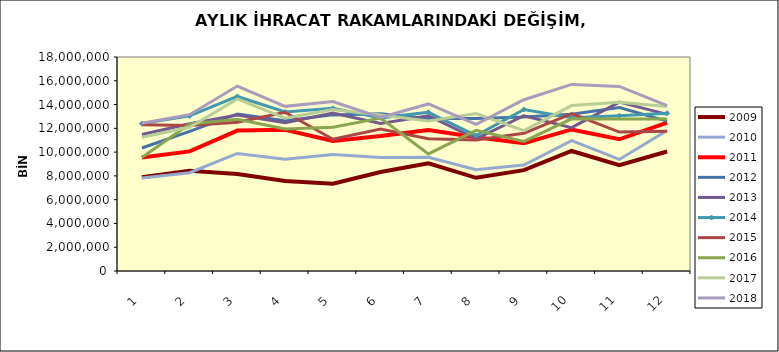
| Category | 2009 | 2010 | 2011 | 2012 | 2013 | 2014 | 2015 | 2016 | 2017 | 2018 |
|---|---|---|---|---|---|---|---|---|---|---|
| 0 | 7884493.524 | 7828748.058 | 9551084.639 | 10348187.166 | 11481521.079 | 12399761.948 | 12301766.75 | 9546115.4 | 11247585.677 | 12434415.589 |
| 1 | 8435115.834 | 8263237.814 | 10059126.307 | 11748000.124 | 12385690.909 | 13053292.493 | 12231860.14 | 12366388.057 | 12089908.934 | 13148699.174 |
| 2 | 8155485.081 | 9886488.171 | 11811085.16 | 13208572.977 | 13122058.141 | 14680110.78 | 12519910.438 | 12757672.093 | 14470814.059 | 15554312.071 |
| 3 | 7561696.283 | 9396006.654 | 11873269.447 | 12630226.718 | 12468202.903 | 13371185.664 | 13349346.866 | 11950497.685 | 12859938.791 | 13847621.73 |
| 4 | 7346407.528 | 9799958.117 | 10943364.372 | 13131530.961 | 13277209.017 | 13681906.159 | 11080385.127 | 12098611.067 | 13582079.731 | 14258671.819 |
| 5 | 8329692.783 | 9542907.644 | 11349953.558 | 13231198.688 | 12399973.962 | 12880924.246 | 11949647.086 | 12864154.06 | 13125306.944 | 12926040.042 |
| 6 | 9055733.671 | 9564682.545 | 11860004.271 | 12830675.307 | 13059519.685 | 13344776.958 | 11129358.974 | 9850124.872 | 12612074.056 | 14051020.026 |
| 7 | 7839908.842 | 8523451.973 | 11245124.657 | 12831394.572 | 11118300.903 | 11386828.925 | 11022045.344 | 11830762.82 | 13248462.99 | 12339775.799 |
| 8 | 8480708.387 | 8909230.521 | 10750626.099 | 12952651.722 | 13060371.039 | 13583120.906 | 11581703.842 | 10901638.452 | 11810080.805 | 14404704.121 |
| 9 | 10095768.03 | 10963586.27 | 11907219.297 | 13190769.655 | 12053704.638 | 12891630.102 | 13240039.088 | 12796159.91 | 13912699.494 | 15691717.07 |
| 10 | 8903010.773 | 9382369.718 | 11078524.743 | 13753052.493 | 14201227.351 | 13067348.107 | 11681989.013 | 12786936.247 | 14188323.116 | 15528896.39 |
| 11 | 10054591.867 | 11822551.699 | 12477486.28 | 12605476.173 | 13174857.46 | 13269271.402 | 11750818.76 | 12780523.145 | 13845665.817 | 13901762.821 |